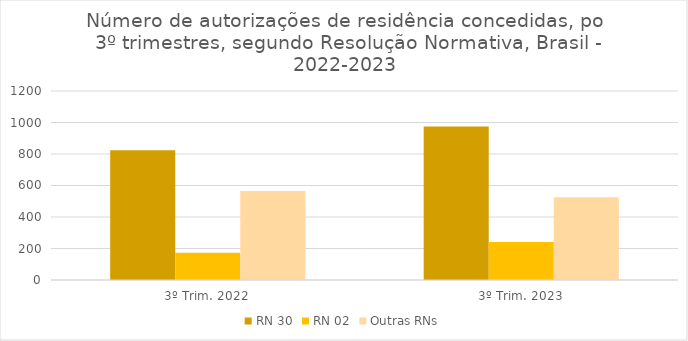
| Category | RN 30 | RN 02 | Outras RNs |
|---|---|---|---|
| 3º Trim. 2022 | 824 | 173 | 565 |
| 3º Trim. 2023 | 975 | 242 | 525 |